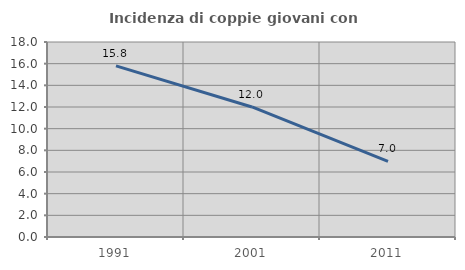
| Category | Incidenza di coppie giovani con figli |
|---|---|
| 1991.0 | 15.8 |
| 2001.0 | 12.003 |
| 2011.0 | 6.972 |